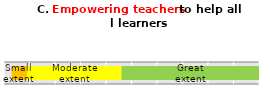
| Category | Series 0 | Series 1 | Series 2 |
|---|---|---|---|
|  | 54 | 37 | 6 |